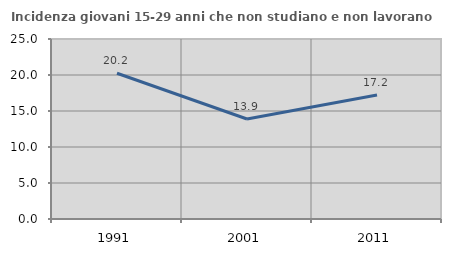
| Category | Incidenza giovani 15-29 anni che non studiano e non lavorano  |
|---|---|
| 1991.0 | 20.24 |
| 2001.0 | 13.886 |
| 2011.0 | 17.218 |